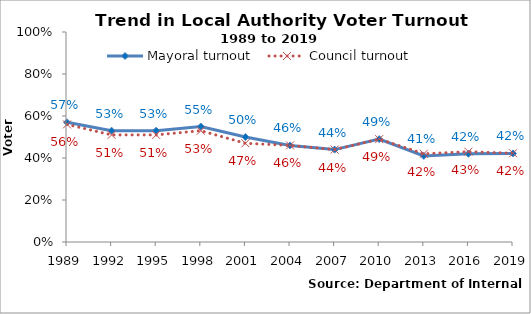
| Category | Mayoral turnout  | Council turnout |
|---|---|---|
| 1989.0 | 0.57 | 0.56 |
| 1992.0 | 0.53 | 0.51 |
| 1995.0 | 0.53 | 0.51 |
| 1998.0 | 0.55 | 0.53 |
| 2001.0 | 0.5 | 0.47 |
| 2004.0 | 0.46 | 0.46 |
| 2007.0 | 0.44 | 0.44 |
| 2010.0 | 0.49 | 0.49 |
| 2013.0 | 0.41 | 0.42 |
| 2016.0 | 0.42 | 0.43 |
| 2019.0 | 0.422 | 0.423 |